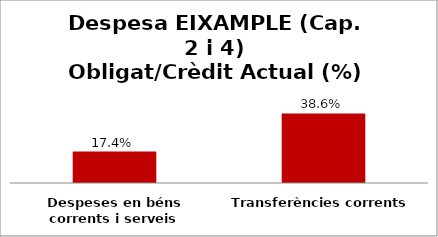
| Category | Series 0 |
|---|---|
| Despeses en béns corrents i serveis | 0.174 |
| Transferències corrents | 0.386 |